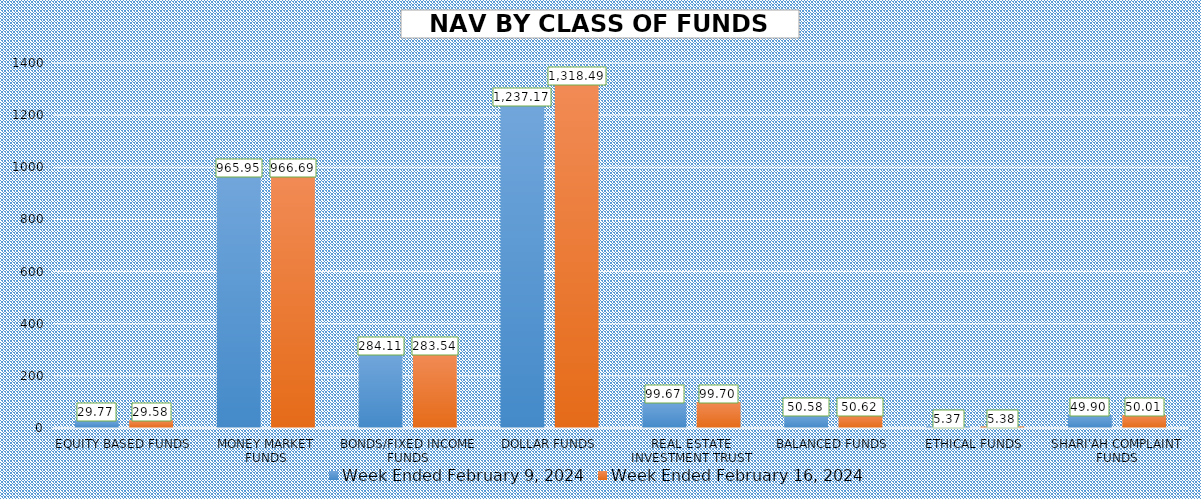
| Category | Week Ended February 9, 2024 | Week Ended February 16, 2024 |
|---|---|---|
| EQUITY BASED FUNDS | 29.773 | 29.579 |
| MONEY MARKET FUNDS | 965.954 | 966.685 |
| BONDS/FIXED INCOME FUNDS | 284.11 | 283.536 |
| DOLLAR FUNDS | 1237.173 | 1318.495 |
| REAL ESTATE INVESTMENT TRUST | 99.672 | 99.705 |
| BALANCED FUNDS | 50.58 | 50.623 |
| ETHICAL FUNDS | 5.372 | 5.382 |
| SHARI'AH COMPLAINT FUNDS | 49.899 | 50.009 |